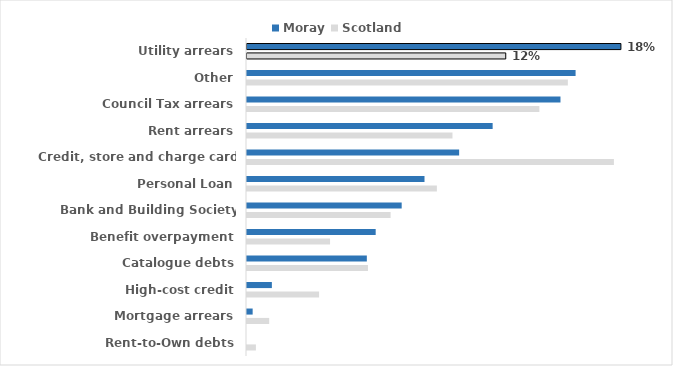
| Category | Moray | Scotland |
|---|---|---|
| Utility arrears | 0.179 | 0.124 |
| Other | 0.158 | 0.154 |
| Council Tax arrears | 0.15 | 0.14 |
| Rent arrears | 0.118 | 0.099 |
| Credit, store and charge card debts | 0.102 | 0.176 |
| Personal Loan | 0.085 | 0.091 |
| Bank and Building Society overdrafts | 0.074 | 0.069 |
| Benefit overpayment | 0.062 | 0.04 |
| Catalogue debts | 0.057 | 0.058 |
| High-cost credit | 0.012 | 0.035 |
| Mortgage arrears | 0.003 | 0.011 |
| Rent-to-Own debts | 0 | 0.004 |